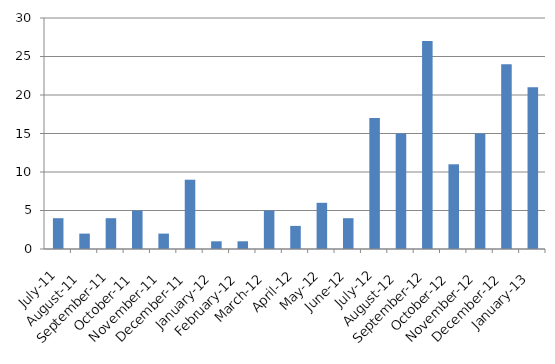
| Category | # |
|---|---|
| 2011-07-02 | 4 |
| 2011-08-02 | 2 |
| 2011-09-02 | 4 |
| 2011-10-02 | 5 |
| 2011-11-02 | 2 |
| 2011-12-02 | 9 |
| 2012-01-02 | 1 |
| 2012-02-02 | 1 |
| 2012-03-02 | 5 |
| 2012-04-02 | 3 |
| 2012-05-02 | 6 |
| 2012-06-02 | 4 |
| 2012-07-02 | 17 |
| 2012-08-02 | 15 |
| 2012-09-02 | 27 |
| 2012-10-02 | 11 |
| 2012-11-02 | 15 |
| 2012-12-02 | 24 |
| 2013-01-02 | 21 |